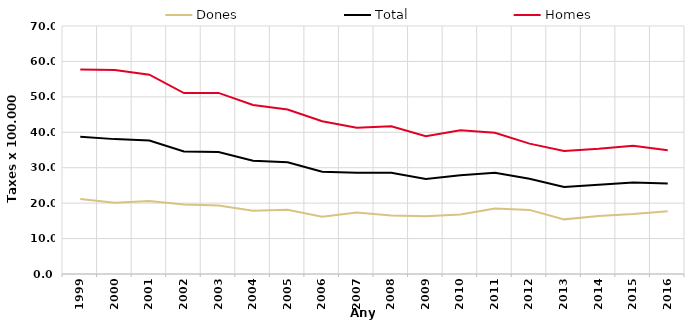
| Category | Dones | Total | Homes |
|---|---|---|---|
| 1999.0 | 21.15 | 38.72 | 57.72 |
| 2000.0 | 20.11 | 38.07 | 57.56 |
| 2001.0 | 20.57 | 37.7 | 56.27 |
| 2002.0 | 19.6 | 34.58 | 51.06 |
| 2003.0 | 19.35 | 34.43 | 51.12 |
| 2004.0 | 17.86 | 31.99 | 47.7 |
| 2005.0 | 18.16 | 31.51 | 46.42 |
| 2006.0 | 16.14 | 28.84 | 43.11 |
| 2007.0 | 17.34 | 28.56 | 41.27 |
| 2008.0 | 16.51 | 28.58 | 41.72 |
| 2009.0 | 16.3 | 26.85 | 38.87 |
| 2010.0 | 16.82 | 27.86 | 40.58 |
| 2011.0 | 18.49 | 28.58 | 39.88 |
| 2012.0 | 18.09 | 26.86 | 36.8 |
| 2013.0 | 15.42 | 24.58 | 34.73 |
| 2014.0 | 16.36 | 25.19 | 35.32 |
| 2015.0 | 16.93 | 25.85 | 36.18 |
| 2016.0 | 17.73 | 25.56 | 34.92 |